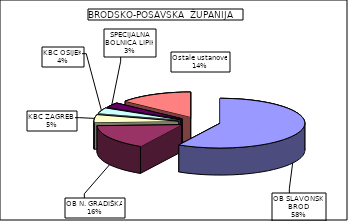
| Category | Series 0 |
|---|---|
| OB SLAVONSKI BROD | 58.1 |
| OB N. GRADIŠKA | 16.251 |
| KBC ZAGREB  | 4.9 |
| KBC OSIJEK | 3.637 |
| SPECIJALNA BOLNICA LIPIK | 3.031 |
| Ostale ustanove | 14.081 |